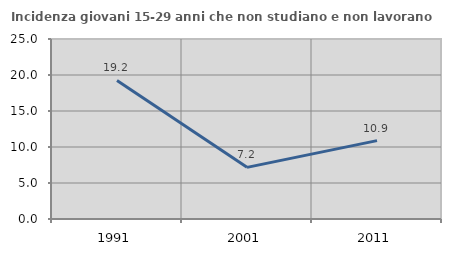
| Category | Incidenza giovani 15-29 anni che non studiano e non lavorano  |
|---|---|
| 1991.0 | 19.239 |
| 2001.0 | 7.171 |
| 2011.0 | 10.886 |